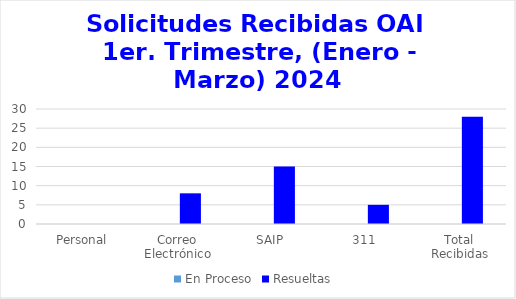
| Category | En Proceso | Resueltas  |
|---|---|---|
| Personal | 0 | 0 |
| Correo Electrónico | 0 | 8 |
| SAIP | 0 | 15 |
| 311 | 0 | 5 |
| Total Recibidas | 0 | 28 |